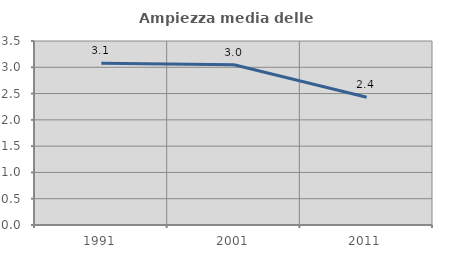
| Category | Ampiezza media delle famiglie |
|---|---|
| 1991.0 | 3.077 |
| 2001.0 | 3.047 |
| 2011.0 | 2.431 |